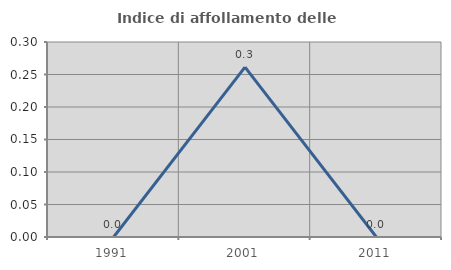
| Category | Indice di affollamento delle abitazioni  |
|---|---|
| 1991.0 | 0 |
| 2001.0 | 0.261 |
| 2011.0 | 0 |